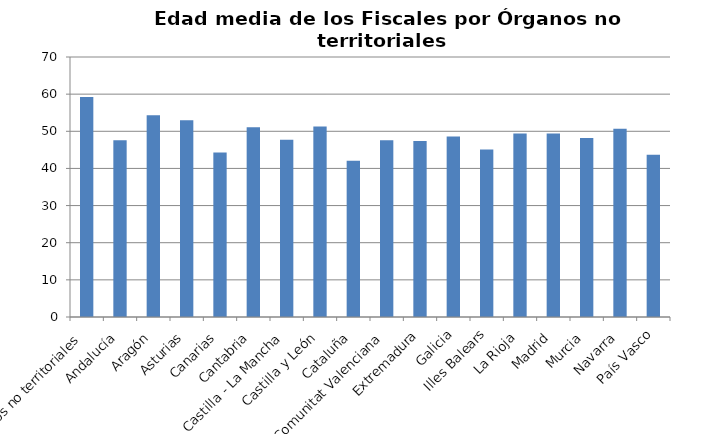
| Category | Edad Media |
|---|---|
| Órganos no territoriales | 59.2 |
| Andalucía | 47.6 |
| Aragón | 54.3 |
| Asturias | 53 |
| Canarias | 44.3 |
| Cantabria | 51.1 |
| Castilla - La Mancha | 47.7 |
| Castilla y León | 51.3 |
| Cataluña | 42.1 |
| Comunitat Valenciana | 47.6 |
| Extremadura | 47.4 |
| Galicia | 48.6 |
| Illes Balears | 45.1 |
| La Rioja | 49.4 |
| Madrid | 49.4 |
| Murcia | 48.2 |
| Navarra | 50.7 |
| País Vasco | 43.7 |